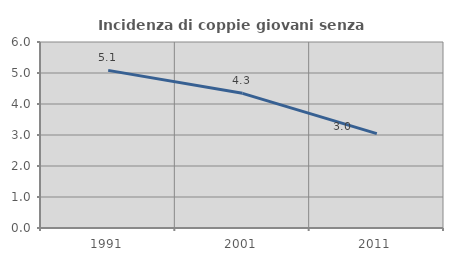
| Category | Incidenza di coppie giovani senza figli |
|---|---|
| 1991.0 | 5.085 |
| 2001.0 | 4.345 |
| 2011.0 | 3.044 |